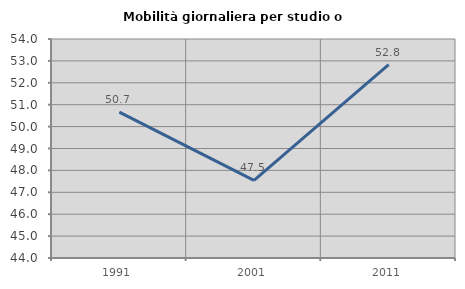
| Category | Mobilità giornaliera per studio o lavoro |
|---|---|
| 1991.0 | 50.664 |
| 2001.0 | 47.548 |
| 2011.0 | 52.83 |